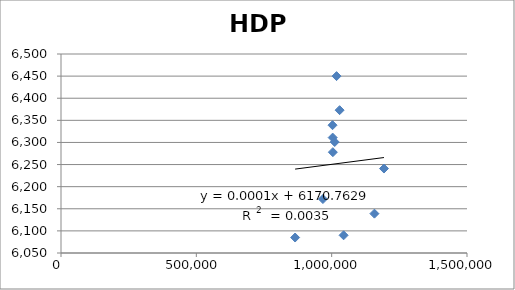
| Category | Series 0 |
|---|---|
| 864989.0 | 6085 |
| 967690.0 | 6172 |
| 1029355.0 | 6373 |
| 1003206.0 | 6339 |
| 1018081.0 | 6450 |
| 1003742.0 | 6311 |
| 1004400.0 | 6278 |
| 1011319.0 | 6301 |
| 1044120.0 | 6090 |
| 1157950.0 | 6139 |
| 1193240.0 | 6241 |